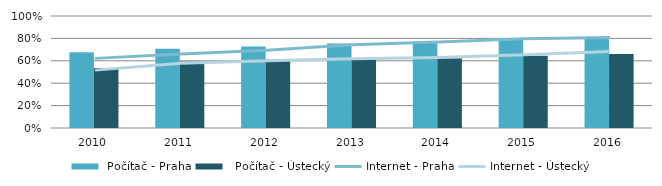
| Category |  Počítač - Praha |   Počítač - Ústecký |
|---|---|---|
| 2010.0 | 0.676 | 0.537 |
| 2011.0 | 0.708 | 0.593 |
| 2012.0 | 0.729 | 0.611 |
| 2013.0 | 0.754 | 0.619 |
| 2014.0 | 0.772 | 0.624 |
| 2015.0 | 0.797 | 0.646 |
| 2016.0 | 0.805 | 0.66 |